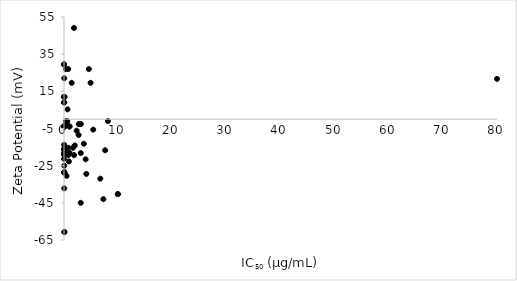
| Category | Series 0 |
|---|---|
| 1.84 | 49.1 |
| 0.011 | 29.5 |
| 0.024 | 29.5 |
| 0.0017 | 29.5 |
| 4.6 | 27 |
| 0.78 | 27 |
| 0.34 | 27 |
| 0.043 | 22 |
| 80.0 | 21.7 |
| 4.91 | 19.59 |
| 1.42 | 19.59 |
| 0.114 | 12 |
| 0.00078 | 12 |
| 0.00497 | 12 |
| 0.0057 | 9 |
| 0.0057 | 9 |
| 0.04 | 9 |
| 0.04 | 9 |
| 0.65 | 5.29 |
| 8.12 | -1 |
| 0.37 | -1 |
| 0.61 | -1 |
| 0.42 | -2.61 |
| 2.73 | -2.61 |
| 3.11 | -2.61 |
| 0.062 | -3.5 |
| 1.019 | -3.9 |
| 0.087 | -3.9 |
| 1.007 | -3.9 |
| 0.137 | -3.9 |
| 0.061 | -3.9 |
| 0.028 | -3.9 |
| 5.4 | -5.6 |
| 2.338 | -6.17 |
| 2.7 | -8.5 |
| 3.67 | -13.2 |
| 0.02611 | -13.8 |
| 2.0 | -14.1 |
| 1.66 | -15.4 |
| 0.79 | -15.4 |
| 0.0028 | -16 |
| 0.09 | -16 |
| 7.6 | -16.7 |
| 0.0396 | -16.7 |
| 0.185 | -17.63 |
| 1.03 | -18.1 |
| 0.13 | -18.1 |
| 0.0118 | -18.2 |
| 3.1 | -18.2 |
| 0.00031 | -18.9 |
| 0.00049 | -18.9 |
| 0.044 | -19 |
| 0.034 | -19 |
| 1.86 | -19.3 |
| 0.8 | -19.3 |
| 0.0033 | -21.32 |
| 4.0 | -21.57 |
| 0.91 | -22.7 |
| 0.05 | -25 |
| 0.053 | -28.6 |
| 0.039 | -28.6 |
| 0.073 | -28.6 |
| 0.027 | -28.6 |
| 4.12 | -29.4 |
| 0.48 | -30.5 |
| 6.71 | -32 |
| 0.051 | -37.2 |
| 9.95 | -40.3 |
| 9.95 | -40.3 |
| 7.28 | -43.03 |
| 3.1 | -45 |
| 0.093 | -60.7 |
| 0.048 | -60.7 |